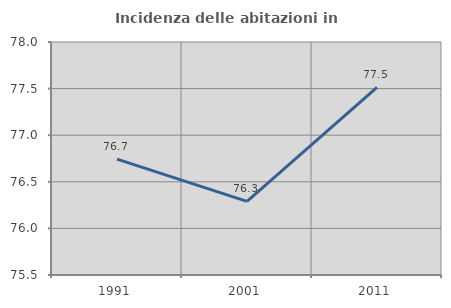
| Category | Incidenza delle abitazioni in proprietà  |
|---|---|
| 1991.0 | 76.743 |
| 2001.0 | 76.289 |
| 2011.0 | 77.512 |